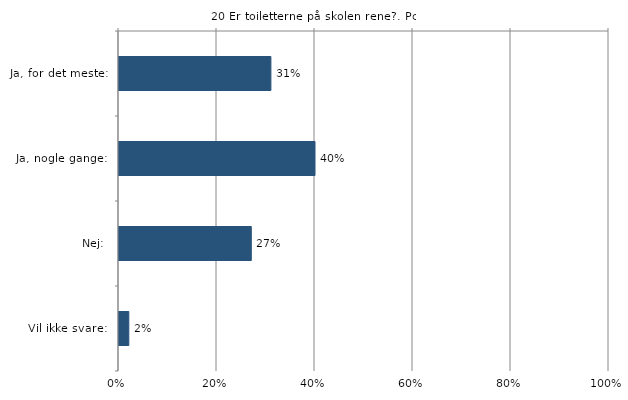
| Category | Er toiletterne på skolen rene? |
|---|---|
| Ja, for det meste:  | 0.31 |
| Ja, nogle gange:  | 0.4 |
| Nej:  | 0.27 |
| Vil ikke svare:  | 0.02 |